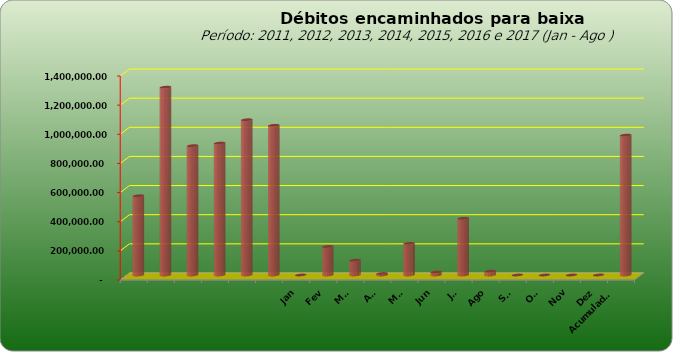
| Category |  543.796,20  |
|---|---|
|  | 543796.2 |
|  | 1289053.69 |
|  | 887573.08 |
|  | 905052.31 |
|  | 1065434.28 |
|  | 1027209.41 |
| Jan | 0 |
| Fev | 195564.55 |
| Mar | 101757.11 |
| Abr | 10195.55 |
| Mai | 217067.29 |
| Jun | 19848.93 |
| Jul | 389298.76 |
| Ago | 26234.02 |
| Set | 0 |
| Out | 0 |
| Nov | 0 |
| Dez | 0 |
| Acumulado
2016 | 959966.21 |